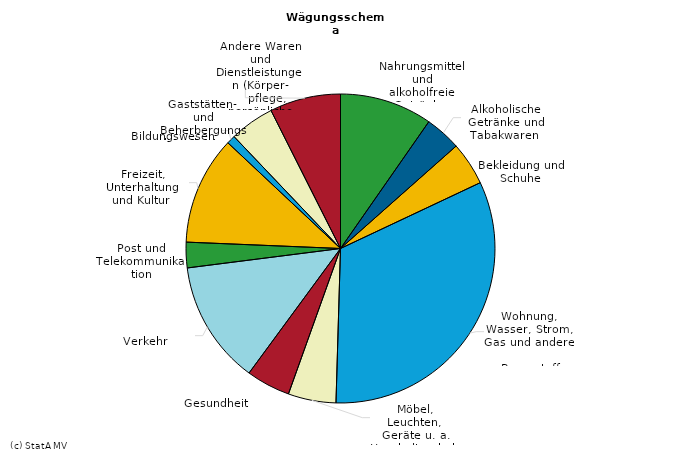
| Category | Series 0 |
|---|---|
| 0 | 9.685 |
| 1 | 3.777 |
| 2 | 4.534 |
| 3 | 32.47 |
| 4 | 5.004 |
| 5 | 4.613 |
| 6 | 12.905 |
| 7 | 2.672 |
| 8 | 11.336 |
| 9 | 0.902 |
| 10 | 4.677 |
| 11 | 7.425 |